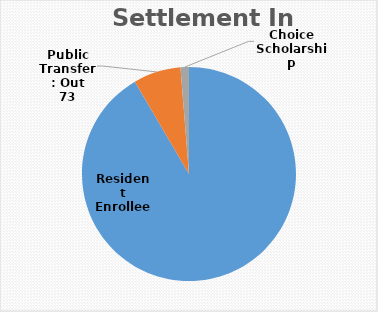
| Category | Series 0 |
|---|---|
| Resident Enrollee | 933 |
| Public Transfer: Out | 73 |
| Choice Scholarship | 13 |